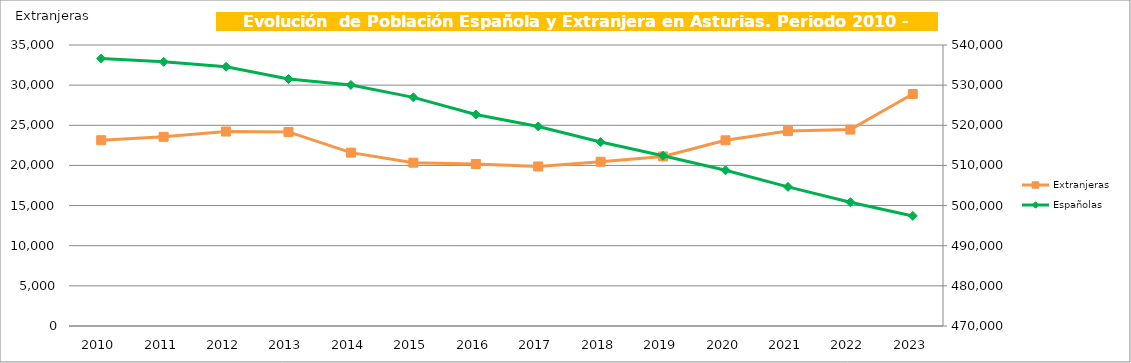
| Category | Extranjeras |
|---|---|
| 2010.0 | 23141 |
| 2011.0 | 23565 |
| 2012.0 | 24223 |
| 2013.0 | 24174 |
| 2014.0 | 21591 |
| 2015.0 | 20341 |
| 2016.0 | 20175 |
| 2017.0 | 19871 |
| 2018.0 | 20460 |
| 2019.0 | 21118 |
| 2020.0 | 23129 |
| 2021.0 | 24280 |
| 2022.0 | 24466 |
| 2023.0 | 28897 |